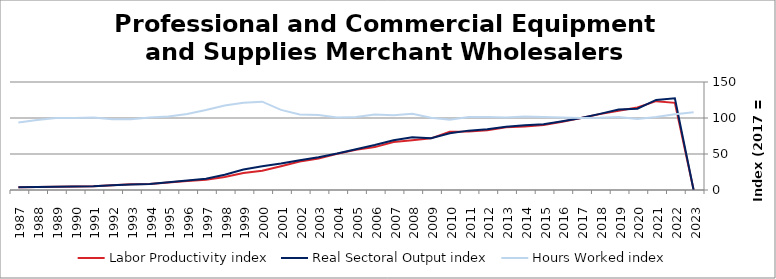
| Category | Labor Productivity index | Real Sectoral Output index | Hours Worked index |
|---|---|---|---|
| 2023.0 | 0 | 0 | 107.897 |
| 2022.0 | 121.098 | 127.43 | 105.229 |
| 2021.0 | 123.416 | 125.128 | 101.387 |
| 2020.0 | 114.694 | 112.984 | 98.509 |
| 2019.0 | 110.107 | 111.789 | 101.527 |
| 2018.0 | 105.379 | 105.755 | 100.357 |
| 2017.0 | 100 | 100 | 100 |
| 2016.0 | 94.849 | 95.39 | 100.57 |
| 2015.0 | 90.143 | 91.297 | 101.28 |
| 2014.0 | 88.128 | 90.096 | 102.233 |
| 2013.0 | 87.253 | 87.965 | 100.816 |
| 2012.0 | 83.152 | 84.409 | 101.512 |
| 2011.0 | 81.391 | 82.458 | 101.312 |
| 2010.0 | 80.985 | 78.894 | 97.418 |
| 2009.0 | 71.721 | 72.029 | 100.429 |
| 2008.0 | 69.173 | 73.183 | 105.797 |
| 2007.0 | 66.756 | 69.206 | 103.67 |
| 2006.0 | 59.584 | 62.468 | 104.84 |
| 2005.0 | 55.744 | 56.6 | 101.536 |
| 2004.0 | 50.357 | 50.776 | 100.832 |
| 2003.0 | 43.827 | 45.626 | 104.105 |
| 2002.0 | 39.467 | 41.436 | 104.989 |
| 2001.0 | 32.989 | 36.702 | 111.253 |
| 2000.0 | 26.819 | 32.896 | 122.657 |
| 1999.0 | 23.555 | 28.535 | 121.145 |
| 1998.0 | 18.051 | 21.208 | 117.492 |
| 1997.0 | 14.173 | 15.735 | 111.019 |
| 1996.0 | 12.38 | 13.059 | 105.485 |
| 1995.0 | 10.418 | 10.644 | 102.167 |
| 1994.0 | 8.431 | 8.492 | 100.731 |
| 1993.0 | 7.83 | 7.692 | 98.238 |
| 1992.0 | 6.606 | 6.497 | 98.349 |
| 1991.0 | 5.251 | 5.288 | 100.712 |
| 1990.0 | 4.774 | 4.767 | 99.852 |
| 1989.0 | 4.544 | 4.543 | 99.983 |
| 1988.0 | 4.188 | 4.07 | 97.196 |
| 1987.0 | 3.898 | 3.659 | 93.866 |